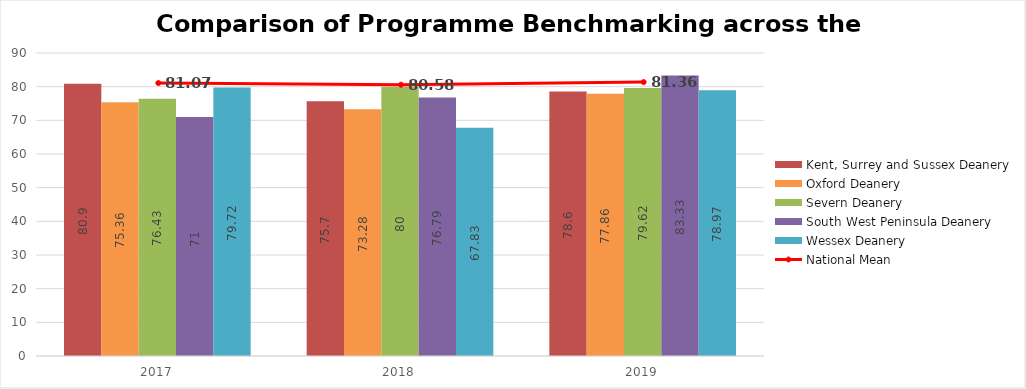
| Category | Kent, Surrey and Sussex Deanery | Oxford Deanery | Severn Deanery | South West Peninsula Deanery | Wessex Deanery |
|---|---|---|---|---|---|
| 2017 | 80.9 | 75.36 | 76.43 | 71 | 79.72 |
| 2018 | 75.7 | 73.28 | 80 | 76.79 | 67.83 |
| 2019 | 78.6 | 77.86 | 79.62 | 83.33 | 78.97 |